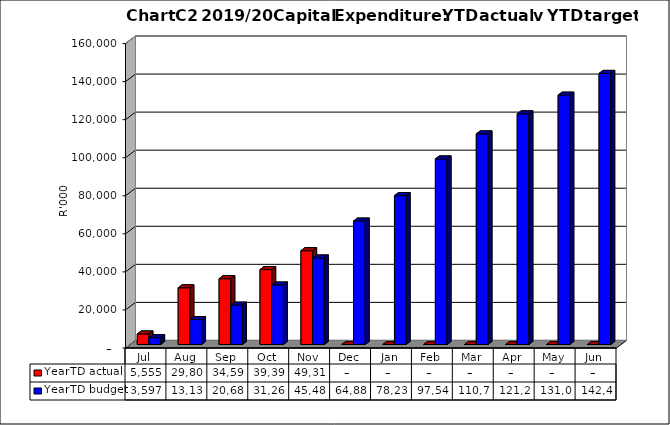
| Category | YearTD actual | YearTD budget |
|---|---|---|
| Jul | 5554740.23 | 3597000 |
| Aug | 29801091.39 | 13137000 |
| Sep | 34591330.1 | 20682000 |
| Oct | 39395801.57 | 31265000 |
| Nov | 49310833.03 | 45485000 |
| Dec | 0 | 64881000 |
| Jan | 0 | 78237000 |
| Feb | 0 | 97546000 |
| Mar | 0 | 110701000 |
| Apr | 0 | 121248000 |
| May | 0 | 131069000 |
| Jun | 0 | 142486000 |